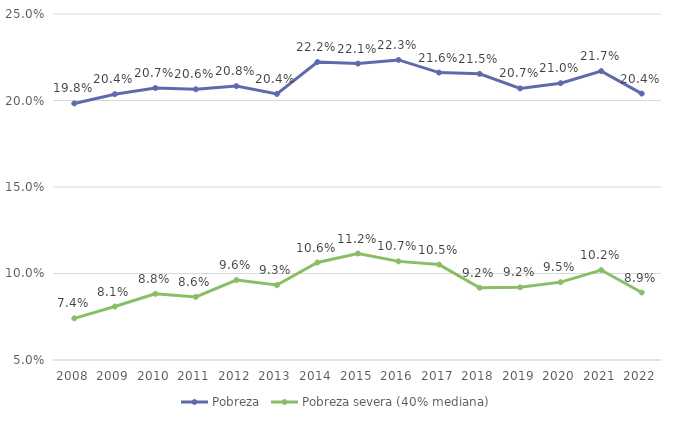
| Category | Pobreza | Pobreza severa (40% mediana) |
|---|---|---|
| 2008.0 | 0.198 | 0.074 |
| 2009.0 | 0.204 | 0.081 |
| 2010.0 | 0.207 | 0.088 |
| 2011.0 | 0.206 | 0.086 |
| 2012.0 | 0.208 | 0.096 |
| 2013.0 | 0.204 | 0.093 |
| 2014.0 | 0.222 | 0.106 |
| 2015.0 | 0.221 | 0.112 |
| 2016.0 | 0.223 | 0.107 |
| 2017.0 | 0.216 | 0.105 |
| 2018.0 | 0.215 | 0.092 |
| 2019.0 | 0.207 | 0.092 |
| 2020.0 | 0.21 | 0.095 |
| 2021.0 | 0.217 | 0.102 |
| 2022.0 | 0.204 | 0.089 |